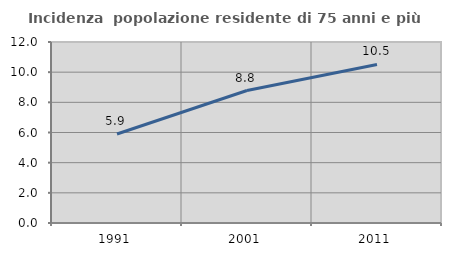
| Category | Incidenza  popolazione residente di 75 anni e più |
|---|---|
| 1991.0 | 5.899 |
| 2001.0 | 8.784 |
| 2011.0 | 10.51 |